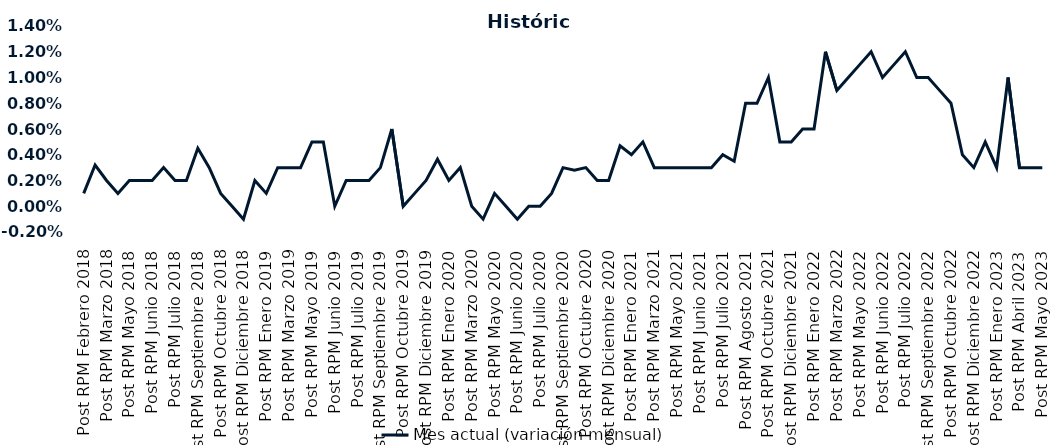
| Category | Mes actual (variación mensual)  |
|---|---|
| Post RPM Febrero 2018 | 0.001 |
| Pre RPM Marzo 2018 | 0.003 |
| Post RPM Marzo 2018 | 0.002 |
| Pre RPM Mayo 2018 | 0.001 |
| Post RPM Mayo 2018 | 0.002 |
| Pre RPM Junio 2018 | 0.002 |
| Post RPM Junio 2018 | 0.002 |
| Pre RPM Julio 2018 | 0.003 |
| Post RPM Julio 2018 | 0.002 |
| Pre RPM Septiembre 2018 | 0.002 |
| Post RPM Septiembre 2018 | 0.004 |
| Pre RPM Octubre 2018 | 0.003 |
| Post RPM Octubre 2018 | 0.001 |
| Pre RPM Diciembre 2018 | 0 |
| Post RPM Diciembre 2018 | -0.001 |
| Pre RPM Enero 2019 | 0.002 |
| Post RPM Enero 2019 | 0.001 |
| Pre RPM Marzo 2019 | 0.003 |
| Post RPM Marzo 2019 | 0.003 |
| Pre RPM Mayo 2019 | 0.003 |
| Post RPM Mayo 2019 | 0.005 |
| Pre RPM Junio 2019 | 0.005 |
| Post RPM Junio 2019 | 0 |
| Pre RPM Julio 2019 | 0.002 |
| Post RPM Julio 2019 | 0.002 |
| Pre RPM Septiembre 2019 | 0.002 |
| Post RPM Septiembre 2019 | 0.003 |
| Pre RPM Octubre 2019 | 0.006 |
| Post RPM Octubre 2019 | 0 |
| Pre RPM Diciembre 2019 | 0.001 |
| Post RPM Diciembre 2019 | 0.002 |
| Pre RPM Enero 2020 | 0.004 |
| Post RPM Enero 2020 | 0.002 |
| Pre RPM Marzo 2020 | 0.003 |
| Post RPM Marzo 2020 | 0 |
| Pre RPM Mayo 2020 | -0.001 |
| Post RPM Mayo 2020 | 0.001 |
| Pre RPM Junio 2020 | 0 |
| Post RPM Junio 2020 | -0.001 |
| Pre RPM Julio 2020 | 0 |
| Post RPM Julio 2020 | 0 |
| Pre RPM Septiembre 2020 | 0.001 |
| Post RPM Septiembre 2020 | 0.003 |
| Pre RPM Octubre 2020 | 0.003 |
| Post RPM Octubre 2020 | 0.003 |
| Pre RPM Diciembre 2020 | 0.002 |
| Post RPM Diciembre 2020 | 0.002 |
| Pre RPM Enero 2021 | 0.005 |
| Post RPM Enero 2021 | 0.004 |
| Pre RPM Marzo 2021 | 0.005 |
| Post RPM Marzo 2021 | 0.003 |
| Pre RPM Mayo 2021 | 0.003 |
| Post RPM Mayo 2021 | 0.003 |
| Pre RPM Junio 2021 | 0.003 |
| Post RPM Junio 2021 | 0.003 |
| Pre RPM Julio 2021 | 0.003 |
| Post RPM Julio 2021 | 0.004 |
| Pre RPM Agosto 2021 | 0.004 |
| Post RPM Agosto 2021 | 0.008 |
| Pre RPM Octubre 2021 | 0.008 |
| Post RPM Octubre 2021 | 0.01 |
| Pre RPM Diciembre 2021 | 0.005 |
| Post RPM Diciembre 2021 | 0.005 |
| Pre RPM Enero 2022 | 0.006 |
| Post RPM Enero 2022 | 0.006 |
| Pre RPM Marzo 2022 | 0.012 |
| Post RPM Marzo 2022 | 0.009 |
| Pre RPM Mayo 2022 | 0.01 |
| Post RPM Mayo 2022 | 0.011 |
| Pre RPM Junio 2022 | 0.012 |
| Post RPM Junio 2022 | 0.01 |
| Pre RPM Julio 2022 | 0.011 |
| Post RPM Julio 2022 | 0.012 |
| Pre RPM Septiembre 2022 | 0.01 |
| Post RPM Septiembre 2022 | 0.01 |
| Pre RPM Octubre 2022 | 0.009 |
| Post RPM Octubre 2022 | 0.008 |
| Pre RPM Diciembre 2022 | 0.004 |
| Post RPM Diciembre 2022 | 0.003 |
| Pre RPM Enero 2023 | 0.005 |
| Post RPM Enero 2023 | 0.003 |
| Pre RPM Abril 2023 | 0.01 |
| Post RPM Abril 2023 | 0.003 |
| Pre RPM Mayo 2023 | 0.003 |
| Post RPM Mayo 2023 | 0.003 |